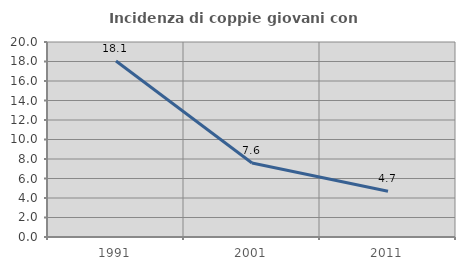
| Category | Incidenza di coppie giovani con figli |
|---|---|
| 1991.0 | 18.054 |
| 2001.0 | 7.593 |
| 2011.0 | 4.699 |